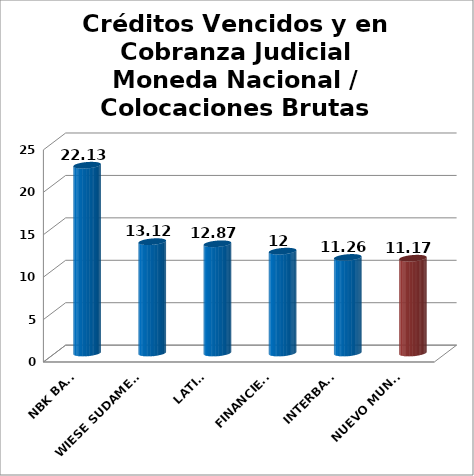
| Category | Series 0 |
|---|---|
| NBK BANK  | 22.13 |
| WIESE SUDAMERIS | 13.12 |
| LATINO | 12.87 |
| FINANCIERO | 12 |
| INTERBANK | 11.26 |
| NUEVO MUNDO | 11.17 |